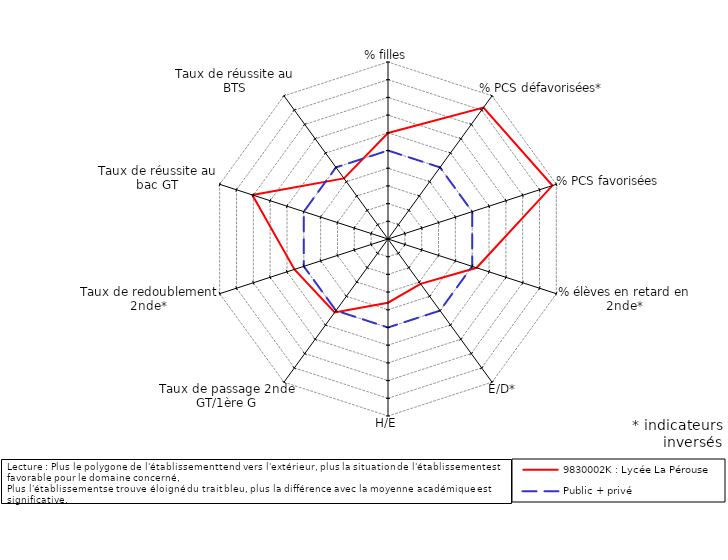
| Category | 9830002K : Lycée La Pérouse | Public + privé |
|---|---|---|
| % filles | 0.986 | 0 |
| % PCS défavorisées* | 4.177 | 0 |
| % PCS favorisées | 4.766 | 0 |
| % élèves en retard en 2nde* | 0.263 | 0 |
| E/D* | -1.871 | 0 |
| H/E | -1.402 | 0 |
| Taux de passage 2nde GT/1ère G | 0.125 | 0 |
| Taux de redoublement 2nde* | 0.556 | 0 |
| Taux de réussite au bac GT | 3.058 | 0 |
| Taux de réussite au BTS | -0.766 | 0 |